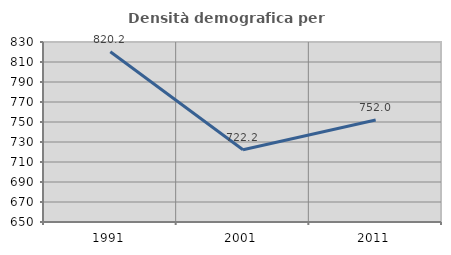
| Category | Densità demografica |
|---|---|
| 1991.0 | 820.201 |
| 2001.0 | 722.218 |
| 2011.0 | 752.021 |